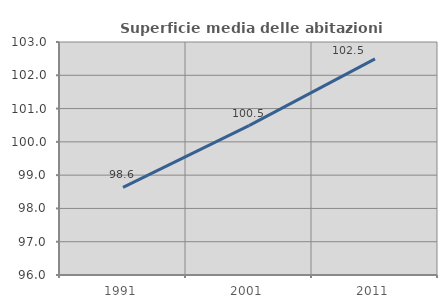
| Category | Superficie media delle abitazioni occupate |
|---|---|
| 1991.0 | 98.634 |
| 2001.0 | 100.489 |
| 2011.0 | 102.492 |